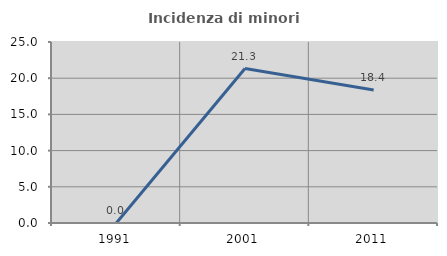
| Category | Incidenza di minori stranieri |
|---|---|
| 1991.0 | 0 |
| 2001.0 | 21.333 |
| 2011.0 | 18.376 |